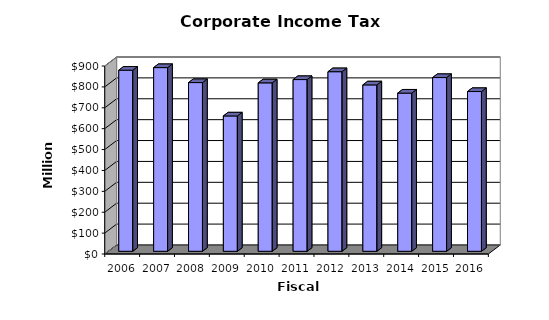
| Category | Amount |
|---|---|
| 2006.0 | 867115786 |
| 2007.0 | 879575371 |
| 2008.0 | 807851584 |
| 2009.0 | 648032537 |
| 2010.0 | 806472760 |
| 2011.0 | 822258802.84 |
| 2012.0 | 859922839.55 |
| 2013.0 | 796728154.4 |
| 2014.0 | 757490742.09 |
| 2015.0 | 831906887.16 |
| 2016.0 | 764948013.77 |